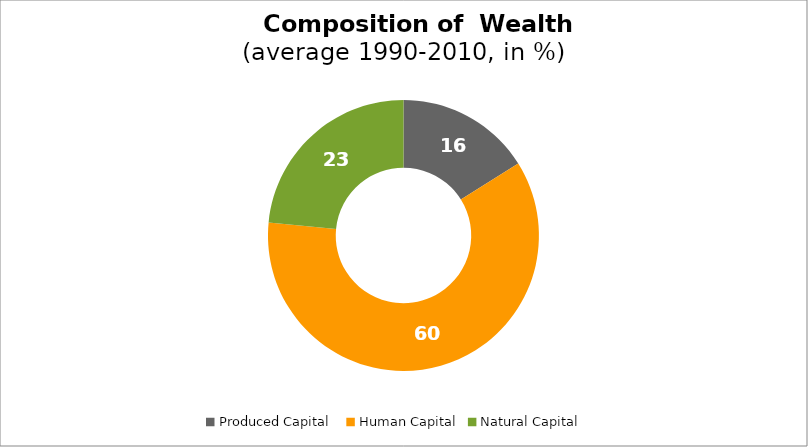
| Category | Series 0 |
|---|---|
| Produced Capital  | 16.073 |
| Human Capital | 60.463 |
| Natural Capital | 23.464 |